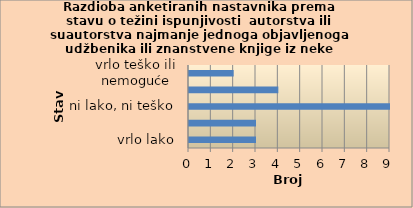
| Category | Series 0 |
|---|---|
| vrlo lako | 3 |
| lako | 3 |
| ni lako, ni teško | 9 |
| teško | 4 |
| vrlo teško ili nemoguće | 2 |